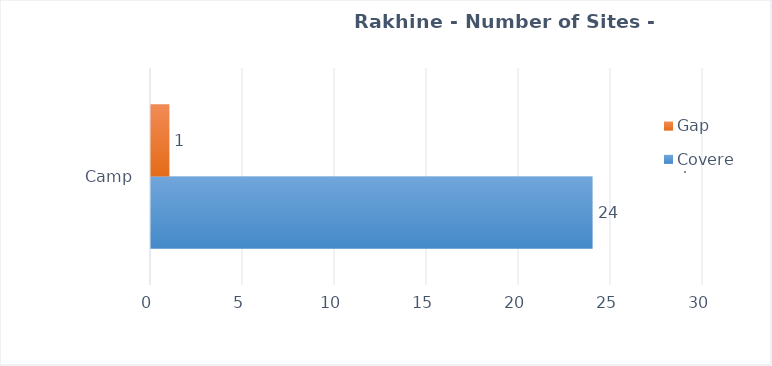
| Category | Covered | Gap |
|---|---|---|
| Camp | 24 | 1 |